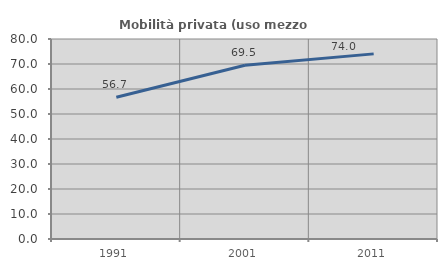
| Category | Mobilità privata (uso mezzo privato) |
|---|---|
| 1991.0 | 56.703 |
| 2001.0 | 69.47 |
| 2011.0 | 74.049 |